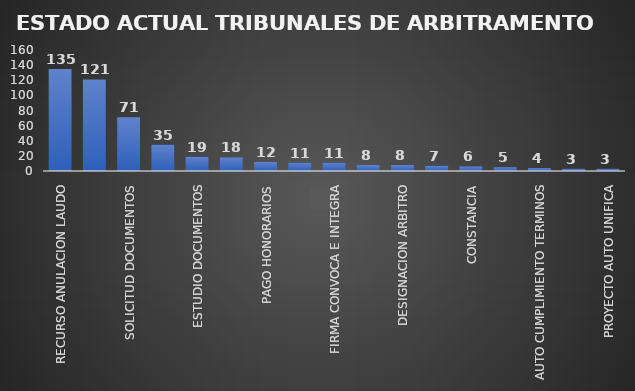
| Category | CANTIDAD | % |
|---|---|---|
| RECURSO ANULACION LAUDO | 135 | 0.282 |
| ESPERA LAUDO | 121 | 0.231 |
| SOLICITUD DOCUMENTOS | 71 | 0.141 |
| PROYECTO ARCHIVO | 35 | 0.079 |
| ESTUDIO DOCUMENTOS | 19 | 0.04 |
| POSESION ARBITROS | 18 | 0.036 |
| PAGO HONORARIOS | 12 | 0.022 |
| ARCHIVADO | 11 | 0.029 |
| FIRMA CONVOCA E INTEGRA | 11 | 0.026 |
| INVESTIGACIÓN ADTIVA LABORAL | 8 | 0.014 |
| DESIGNACION ARBITRO | 8 | 0.021 |
| CUMPLIMIENTO AUTO UNIFICA | 7 | 0.014 |
| CONSTANCIA | 6 | 0.016 |
| PROYECTO MODIFICA RESOLUCION | 5 | 0.01 |
| AUTO CUMPLIMIENTO TERMINOS | 4 | 0.007 |
| PROYECTO RECURSO REPOSICION | 3 | 0.006 |
| PROYECTO AUTO UNIFICA | 3 | 0.007 |